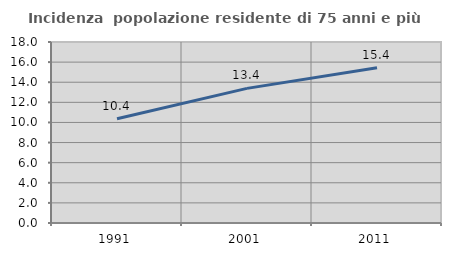
| Category | Incidenza  popolazione residente di 75 anni e più |
|---|---|
| 1991.0 | 10.361 |
| 2001.0 | 13.387 |
| 2011.0 | 15.437 |